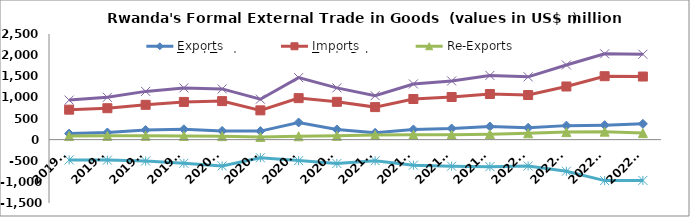
| Category | Exports | Imports | Re-Exports | Total Trade | Trade Balance |
|---|---|---|---|---|---|
| 2019Q1 | 142.242 | 708.669 | 84.663 | 935.575 | -481.764 |
| 2019Q2 | 169.001 | 743.119 | 89.245 | 1001.364 | -484.873 |
| 2019Q3 | 226.995 | 823.945 | 90.655 | 1141.596 | -506.294 |
| 2019Q4 | 244.884 | 892.376 | 87.333 | 1224.592 | -560.159 |
| 2020Q1 | 206.759 | 911.366 | 82.251 | 1200.376 | -622.355 |
| 2020Q2 | 201.782 | 692.708 | 62.646 | 957.137 | -428.28 |
| 2020Q3 | 405.991 | 982.229 | 79.358 | 1467.578 | -496.88 |
| 2020Q4 | 240.255 | 894.488 | 89.908 | 1224.65 | -564.325 |
| 2021Q1 | 161.833 | 769.74 | 108.557 | 1040.13 | -499.35 |
| 2021Q2 | 241.493 | 961.444 | 114.995 | 1317.932 | -604.956 |
| 2021Q3 | 263.449 | 1008.684 | 116.573 | 1388.707 | -628.662 |
| 2021Q4 | 310.559 | 1079.66 | 129.387 | 1519.606 | -639.713 |
| 2022Q1 | 280.673 | 1055.385 | 150.457 | 1486.514 | -624.255 |
| 2022Q2 | 331.324 | 1257.722 | 178.23 | 1767.275 | -748.168 |
| 2022Q3 | 342.685 | 1500.789 | 187.764 | 2031.239 | -970.34 |
| 2022Q4 | 373.39 | 1493.343 | 154.389 | 2021.122 | -965.564 |